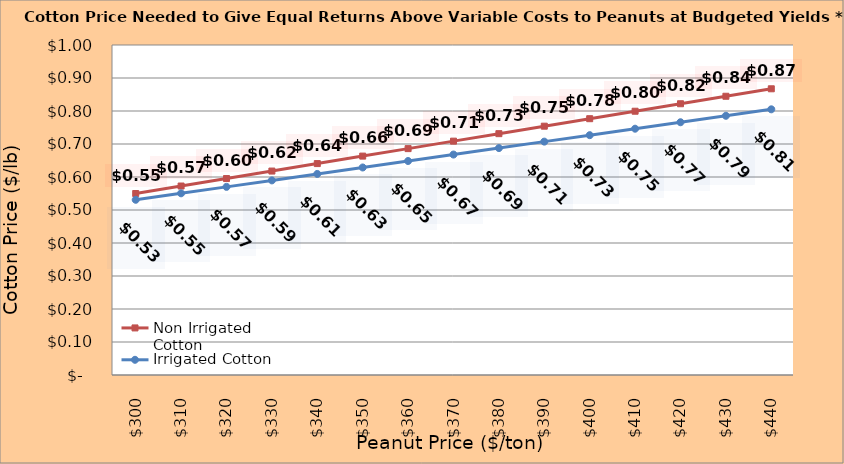
| Category | Non Irrigated Cotton | Irrigated Cotton |
|---|---|---|
| 299.8936170212766 | 0.55 | 0.531 |
| 309.8936170212766 | 0.573 | 0.551 |
| 319.8936170212766 | 0.595 | 0.57 |
| 329.8936170212766 | 0.618 | 0.59 |
| 339.8936170212766 | 0.641 | 0.609 |
| 349.8936170212766 | 0.663 | 0.629 |
| 359.8936170212766 | 0.686 | 0.648 |
| 369.8936170212766 | 0.709 | 0.668 |
| 379.8936170212766 | 0.731 | 0.688 |
| 389.8936170212766 | 0.754 | 0.707 |
| 399.8936170212766 | 0.777 | 0.727 |
| 409.8936170212766 | 0.799 | 0.746 |
| 419.8936170212766 | 0.822 | 0.766 |
| 429.8936170212766 | 0.845 | 0.786 |
| 439.8936170212766 | 0.867 | 0.805 |